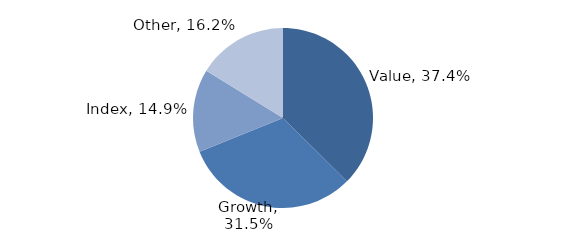
| Category | Investment Style |
|---|---|
| Value | 0.374 |
| Growth | 0.315 |
| Index | 0.149 |
| Other | 0.162 |